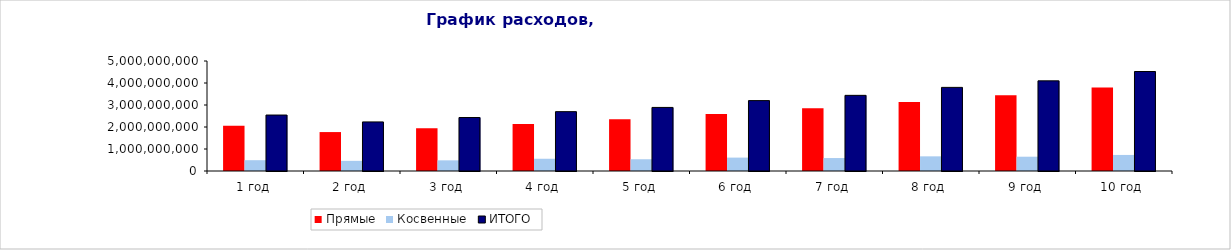
| Category | Прямые | Косвенные | ИТОГО |
|---|---|---|---|
| 1 год | 2052604500 | 491317500 | 2543922000 |
| 2 год | 1769378250 | 461522250 | 2230900500 |
| 3 год | 1946316075 | 484598362.5 | 2430914437.5 |
| 4 год | 2140947682.5 | 556828280.625 | 2697775963.125 |
| 5 год | 2355042450.75 | 534269694.656 | 2889312145.406 |
| 6 год | 2590546695.825 | 608983179.389 | 3199529875.214 |
| 7 год | 2849601365.408 | 589032338.359 | 3438633703.766 |
| 8 год | 3134561501.948 | 666483955.276 | 3801045457.225 |
| 9 год | 3448017652.143 | 649408153.04 | 4097425805.183 |
| 10 год | 3792819417.357 | 729878560.692 | 4522697978.05 |